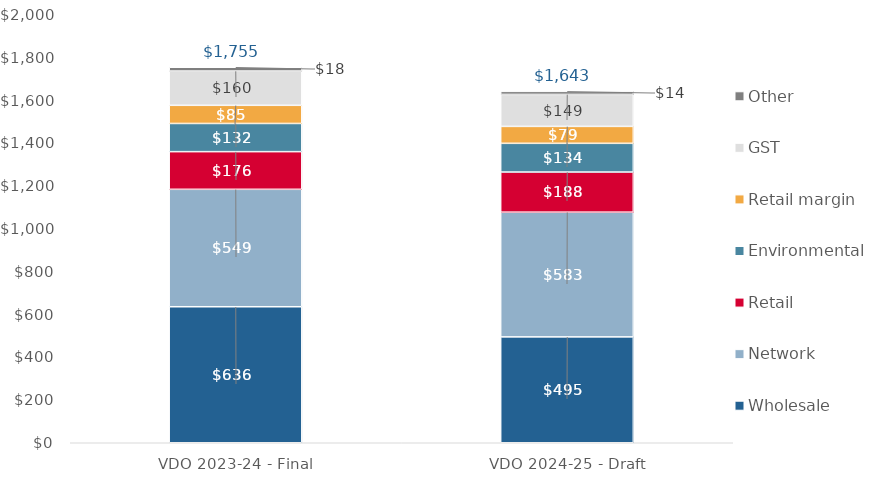
| Category | Wholesale | Network | Retail | Environmental | Retail margin | GST | Other |
|---|---|---|---|---|---|---|---|
| VDO 2023-24 - Final | 635.566 | 548.785 | 175.924 | 131.696 | 84.863 | 160.028 | 17.776 |
| VDO 2024-25 - Draft | 494.678 | 582.829 | 187.594 | 134.098 | 79.16 | 149.274 | 14.38 |